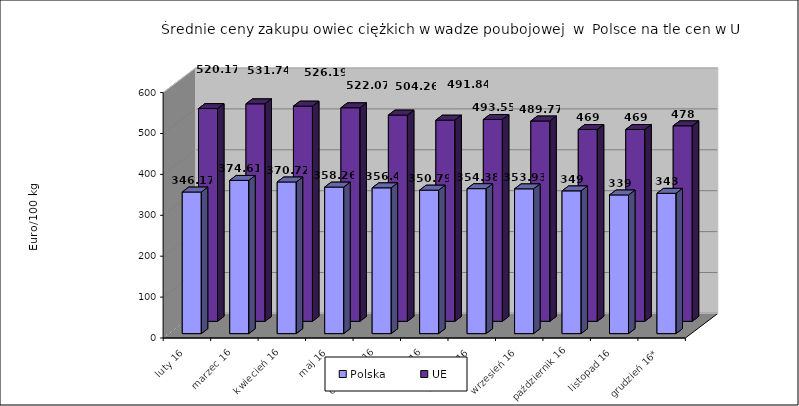
| Category | Polska  | UE |
|---|---|---|
| luty 16 | 346.17 | 520.17 |
| marzec 16 | 374.61 | 531.74 |
| kwiecień 16 | 370.72 | 526.19 |
| maj 16 | 358.26 | 522.07 |
| czerwiec 16 | 356.4 | 504.26 |
| lipiec 16 | 350.79 | 491.84 |
| sierpień 16 | 354.38 | 493.55 |
| wrzesień 16 | 353.93 | 489.77 |
| październik 16 | 349 | 469 |
| listopad 16 | 339 | 469 |
| grudzień 16* | 343 | 478 |